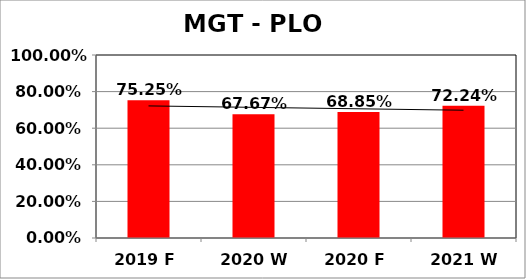
| Category | Series 0 |
|---|---|
| 2019 F | 0.752 |
| 2020 W | 0.677 |
| 2020 F | 0.688 |
| 2021 W | 0.722 |